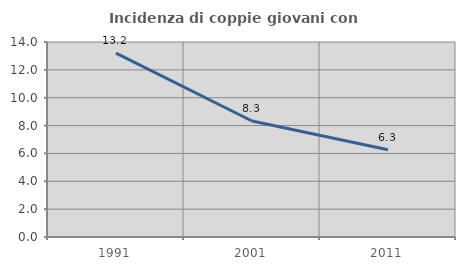
| Category | Incidenza di coppie giovani con figli |
|---|---|
| 1991.0 | 13.208 |
| 2001.0 | 8.327 |
| 2011.0 | 6.265 |